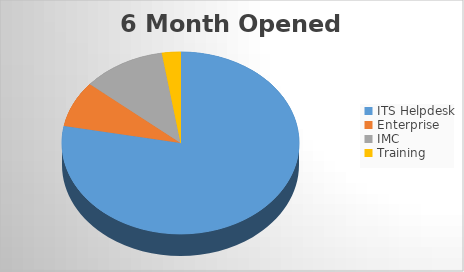
| Category | 6M Opened |
|---|---|
| ITS Helpdesk | 1418 |
| Enterprise | 148 |
| IMC | 206 |
| Training | 46 |